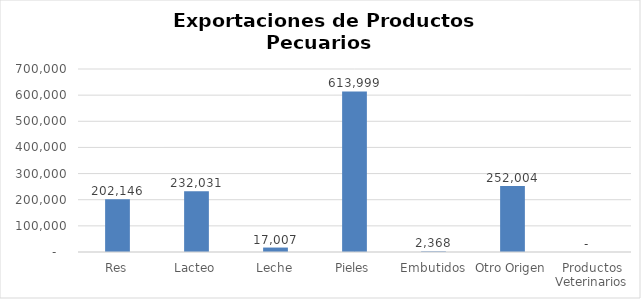
| Category | Kilos |
|---|---|
| Res | 202146.017 |
| Lacteo | 232031.015 |
| Leche | 17007.02 |
| Pieles | 613998.78 |
| Embutidos | 2368.238 |
| Otro Origen | 252004.26 |
| Productos Veterinarios | 0 |